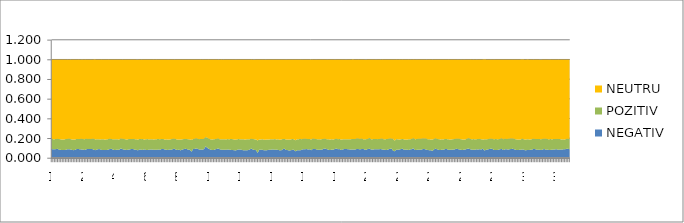
| Category | NEGATIV | POZITIV | NEUTRU |
|---|---|---|---|
| 0 | 0.092 | 0.109 | 0.799 |
| 1 | 0.091 | 0.102 | 0.807 |
| 2 | 0.089 | 0.103 | 0.808 |
| 3 | 0.092 | 0.103 | 0.805 |
| 4 | 0.095 | 0.101 | 0.804 |
| 5 | 0.085 | 0.109 | 0.806 |
| 6 | 0.084 | 0.107 | 0.809 |
| 7 | 0.082 | 0.107 | 0.811 |
| 8 | 0.082 | 0.107 | 0.811 |
| 9 | 0.084 | 0.11 | 0.806 |
| 10 | 0.089 | 0.106 | 0.804 |
| 11 | 0.091 | 0.107 | 0.802 |
| 12 | 0.089 | 0.106 | 0.804 |
| 13 | 0.084 | 0.106 | 0.81 |
| 14 | 0.081 | 0.108 | 0.811 |
| 15 | 0.083 | 0.106 | 0.811 |
| 16 | 0.092 | 0.103 | 0.805 |
| 17 | 0.092 | 0.102 | 0.807 |
| 18 | 0.091 | 0.103 | 0.806 |
| 19 | 0.088 | 0.109 | 0.802 |
| 20 | 0.087 | 0.108 | 0.806 |
| 21 | 0.083 | 0.109 | 0.808 |
| 22 | 0.089 | 0.108 | 0.804 |
| 23 | 0.093 | 0.102 | 0.805 |
| 24 | 0.094 | 0.102 | 0.804 |
| 25 | 0.093 | 0.101 | 0.805 |
| 26 | 0.092 | 0.105 | 0.803 |
| 27 | 0.085 | 0.111 | 0.805 |
| 28 | 0.081 | 0.109 | 0.811 |
| 29 | 0.087 | 0.106 | 0.807 |
| 30 | 0.092 | 0.1 | 0.808 |
| 31 | 0.091 | 0.099 | 0.81 |
| 32 | 0.083 | 0.109 | 0.809 |
| 33 | 0.082 | 0.111 | 0.807 |
| 34 | 0.082 | 0.106 | 0.812 |
| 35 | 0.082 | 0.109 | 0.809 |
| 36 | 0.086 | 0.107 | 0.808 |
| 37 | 0.092 | 0.105 | 0.803 |
| 38 | 0.095 | 0.1 | 0.805 |
| 39 | 0.088 | 0.104 | 0.808 |
| 40 | 0.083 | 0.108 | 0.809 |
| 41 | 0.084 | 0.109 | 0.807 |
| 42 | 0.085 | 0.107 | 0.808 |
| 43 | 0.084 | 0.105 | 0.811 |
| 44 | 0.098 | 0.101 | 0.801 |
| 45 | 0.093 | 0.104 | 0.802 |
| 46 | 0.087 | 0.108 | 0.805 |
| 47 | 0.085 | 0.107 | 0.808 |
| 48 | 0.083 | 0.106 | 0.811 |
| 49 | 0.087 | 0.107 | 0.806 |
| 50 | 0.089 | 0.105 | 0.806 |
| 51 | 0.094 | 0.1 | 0.806 |
| 52 | 0.092 | 0.104 | 0.804 |
| 53 | 0.086 | 0.107 | 0.807 |
| 54 | 0.084 | 0.107 | 0.808 |
| 55 | 0.079 | 0.111 | 0.809 |
| 56 | 0.089 | 0.106 | 0.805 |
| 57 | 0.086 | 0.107 | 0.806 |
| 58 | 0.083 | 0.112 | 0.805 |
| 59 | 0.09 | 0.099 | 0.811 |
| 60 | 0.083 | 0.109 | 0.808 |
| 61 | 0.083 | 0.111 | 0.806 |
| 62 | 0.085 | 0.105 | 0.81 |
| 63 | 0.087 | 0.106 | 0.807 |
| 64 | 0.088 | 0.104 | 0.808 |
| 65 | 0.084 | 0.106 | 0.811 |
| 66 | 0.084 | 0.107 | 0.809 |
| 67 | 0.085 | 0.108 | 0.808 |
| 68 | 0.087 | 0.107 | 0.806 |
| 69 | 0.085 | 0.107 | 0.808 |
| 70 | 0.093 | 0.102 | 0.805 |
| 71 | 0.093 | 0.102 | 0.805 |
| 72 | 0.088 | 0.101 | 0.811 |
| 73 | 0.085 | 0.106 | 0.809 |
| 74 | 0.083 | 0.105 | 0.811 |
| 75 | 0.088 | 0.101 | 0.811 |
| 76 | 0.084 | 0.108 | 0.808 |
| 77 | 0.091 | 0.106 | 0.803 |
| 78 | 0.095 | 0.103 | 0.801 |
| 79 | 0.088 | 0.106 | 0.806 |
| 80 | 0.083 | 0.105 | 0.812 |
| 81 | 0.086 | 0.104 | 0.81 |
| 82 | 0.079 | 0.109 | 0.812 |
| 83 | 0.086 | 0.105 | 0.809 |
| 84 | 0.091 | 0.103 | 0.806 |
| 85 | 0.095 | 0.101 | 0.804 |
| 86 | 0.092 | 0.102 | 0.806 |
| 87 | 0.086 | 0.106 | 0.808 |
| 88 | 0.084 | 0.106 | 0.81 |
| 89 | 0.065 | 0.12 | 0.815 |
| 90 | 0.092 | 0.101 | 0.807 |
| 91 | 0.094 | 0.103 | 0.803 |
| 92 | 0.099 | 0.102 | 0.799 |
| 93 | 0.094 | 0.102 | 0.804 |
| 94 | 0.087 | 0.106 | 0.807 |
| 95 | 0.089 | 0.106 | 0.806 |
| 96 | 0.085 | 0.108 | 0.806 |
| 97 | 0.094 | 0.104 | 0.802 |
| 98 | 0.119 | 0.097 | 0.784 |
| 99 | 0.106 | 0.101 | 0.793 |
| 100 | 0.094 | 0.104 | 0.803 |
| 101 | 0.088 | 0.104 | 0.808 |
| 102 | 0.082 | 0.108 | 0.81 |
| 103 | 0.082 | 0.109 | 0.809 |
| 104 | 0.09 | 0.104 | 0.806 |
| 105 | 0.093 | 0.103 | 0.804 |
| 106 | 0.099 | 0.101 | 0.799 |
| 107 | 0.09 | 0.101 | 0.809 |
| 108 | 0.085 | 0.108 | 0.808 |
| 109 | 0.084 | 0.108 | 0.807 |
| 110 | 0.085 | 0.107 | 0.808 |
| 111 | 0.084 | 0.106 | 0.81 |
| 112 | 0.089 | 0.105 | 0.806 |
| 113 | 0.085 | 0.106 | 0.809 |
| 114 | 0.084 | 0.111 | 0.805 |
| 115 | 0.082 | 0.111 | 0.807 |
| 116 | 0.081 | 0.109 | 0.81 |
| 117 | 0.078 | 0.11 | 0.811 |
| 118 | 0.084 | 0.108 | 0.808 |
| 119 | 0.088 | 0.106 | 0.806 |
| 120 | 0.088 | 0.103 | 0.809 |
| 121 | 0.083 | 0.108 | 0.809 |
| 122 | 0.08 | 0.112 | 0.808 |
| 123 | 0.079 | 0.11 | 0.811 |
| 124 | 0.079 | 0.112 | 0.809 |
| 125 | 0.082 | 0.109 | 0.809 |
| 126 | 0.088 | 0.104 | 0.808 |
| 127 | 0.097 | 0.101 | 0.803 |
| 128 | 0.087 | 0.107 | 0.805 |
| 129 | 0.083 | 0.109 | 0.807 |
| 130 | 0.081 | 0.108 | 0.811 |
| 131 | 0.053 | 0.127 | 0.82 |
| 132 | 0.086 | 0.104 | 0.81 |
| 133 | 0.084 | 0.105 | 0.811 |
| 134 | 0.085 | 0.108 | 0.807 |
| 135 | 0.08 | 0.108 | 0.812 |
| 136 | 0.079 | 0.109 | 0.811 |
| 137 | 0.081 | 0.108 | 0.811 |
| 138 | 0.084 | 0.105 | 0.811 |
| 139 | 0.085 | 0.106 | 0.809 |
| 140 | 0.087 | 0.104 | 0.809 |
| 141 | 0.088 | 0.103 | 0.809 |
| 142 | 0.084 | 0.11 | 0.806 |
| 143 | 0.087 | 0.102 | 0.811 |
| 144 | 0.083 | 0.109 | 0.808 |
| 145 | 0.08 | 0.107 | 0.813 |
| 146 | 0.08 | 0.11 | 0.81 |
| 147 | 0.091 | 0.104 | 0.805 |
| 148 | 0.096 | 0.099 | 0.805 |
| 149 | 0.083 | 0.107 | 0.809 |
| 150 | 0.082 | 0.106 | 0.812 |
| 151 | 0.078 | 0.111 | 0.811 |
| 152 | 0.08 | 0.109 | 0.811 |
| 153 | 0.084 | 0.111 | 0.805 |
| 154 | 0.085 | 0.107 | 0.808 |
| 155 | 0.069 | 0.112 | 0.819 |
| 156 | 0.079 | 0.114 | 0.807 |
| 157 | 0.08 | 0.111 | 0.809 |
| 158 | 0.079 | 0.118 | 0.804 |
| 159 | 0.085 | 0.107 | 0.807 |
| 160 | 0.091 | 0.106 | 0.803 |
| 161 | 0.091 | 0.106 | 0.803 |
| 162 | 0.092 | 0.104 | 0.804 |
| 163 | 0.088 | 0.106 | 0.806 |
| 164 | 0.09 | 0.104 | 0.806 |
| 165 | 0.081 | 0.109 | 0.809 |
| 166 | 0.093 | 0.106 | 0.802 |
| 167 | 0.094 | 0.102 | 0.804 |
| 168 | 0.091 | 0.104 | 0.804 |
| 169 | 0.085 | 0.106 | 0.809 |
| 170 | 0.085 | 0.107 | 0.808 |
| 171 | 0.085 | 0.105 | 0.81 |
| 172 | 0.087 | 0.107 | 0.806 |
| 173 | 0.095 | 0.101 | 0.804 |
| 174 | 0.096 | 0.101 | 0.803 |
| 175 | 0.091 | 0.101 | 0.807 |
| 176 | 0.085 | 0.107 | 0.808 |
| 177 | 0.082 | 0.107 | 0.811 |
| 178 | 0.087 | 0.105 | 0.808 |
| 179 | 0.086 | 0.103 | 0.811 |
| 180 | 0.093 | 0.101 | 0.805 |
| 181 | 0.097 | 0.101 | 0.802 |
| 182 | 0.091 | 0.101 | 0.808 |
| 183 | 0.092 | 0.103 | 0.805 |
| 184 | 0.082 | 0.106 | 0.812 |
| 185 | 0.089 | 0.102 | 0.809 |
| 186 | 0.092 | 0.099 | 0.809 |
| 187 | 0.094 | 0.098 | 0.807 |
| 188 | 0.091 | 0.101 | 0.808 |
| 189 | 0.09 | 0.103 | 0.807 |
| 190 | 0.086 | 0.105 | 0.809 |
| 191 | 0.088 | 0.107 | 0.806 |
| 192 | 0.088 | 0.107 | 0.806 |
| 193 | 0.088 | 0.106 | 0.806 |
| 194 | 0.094 | 0.107 | 0.799 |
| 195 | 0.092 | 0.107 | 0.802 |
| 196 | 0.089 | 0.106 | 0.805 |
| 197 | 0.092 | 0.107 | 0.801 |
| 198 | 0.094 | 0.099 | 0.807 |
| 199 | 0.086 | 0.106 | 0.807 |
| 200 | 0.086 | 0.107 | 0.806 |
| 201 | 0.093 | 0.103 | 0.804 |
| 202 | 0.095 | 0.11 | 0.795 |
| 203 | 0.089 | 0.104 | 0.807 |
| 204 | 0.087 | 0.106 | 0.807 |
| 205 | 0.089 | 0.105 | 0.806 |
| 206 | 0.09 | 0.104 | 0.805 |
| 207 | 0.089 | 0.104 | 0.807 |
| 208 | 0.091 | 0.104 | 0.805 |
| 209 | 0.092 | 0.104 | 0.803 |
| 210 | 0.089 | 0.11 | 0.802 |
| 211 | 0.086 | 0.107 | 0.807 |
| 212 | 0.084 | 0.108 | 0.808 |
| 213 | 0.083 | 0.111 | 0.806 |
| 214 | 0.088 | 0.108 | 0.804 |
| 215 | 0.095 | 0.104 | 0.801 |
| 216 | 0.097 | 0.101 | 0.802 |
| 217 | 0.076 | 0.121 | 0.803 |
| 218 | 0.069 | 0.109 | 0.822 |
| 219 | 0.086 | 0.108 | 0.807 |
| 220 | 0.085 | 0.106 | 0.809 |
| 221 | 0.087 | 0.103 | 0.811 |
| 222 | 0.092 | 0.099 | 0.809 |
| 223 | 0.096 | 0.1 | 0.805 |
| 224 | 0.084 | 0.106 | 0.81 |
| 225 | 0.087 | 0.103 | 0.81 |
| 226 | 0.085 | 0.104 | 0.811 |
| 227 | 0.083 | 0.109 | 0.809 |
| 228 | 0.089 | 0.103 | 0.807 |
| 229 | 0.092 | 0.105 | 0.803 |
| 230 | 0.1 | 0.102 | 0.799 |
| 231 | 0.083 | 0.109 | 0.808 |
| 232 | 0.084 | 0.11 | 0.805 |
| 233 | 0.085 | 0.112 | 0.803 |
| 234 | 0.084 | 0.112 | 0.804 |
| 235 | 0.087 | 0.11 | 0.803 |
| 236 | 0.092 | 0.109 | 0.799 |
| 237 | 0.092 | 0.106 | 0.802 |
| 238 | 0.087 | 0.112 | 0.8 |
| 239 | 0.082 | 0.11 | 0.808 |
| 240 | 0.081 | 0.11 | 0.809 |
| 241 | 0.081 | 0.109 | 0.81 |
| 242 | 0.074 | 0.115 | 0.81 |
| 243 | 0.089 | 0.106 | 0.805 |
| 244 | 0.096 | 0.106 | 0.798 |
| 245 | 0.09 | 0.104 | 0.806 |
| 246 | 0.084 | 0.109 | 0.807 |
| 247 | 0.083 | 0.107 | 0.81 |
| 248 | 0.085 | 0.106 | 0.809 |
| 249 | 0.086 | 0.104 | 0.81 |
| 250 | 0.092 | 0.104 | 0.804 |
| 251 | 0.093 | 0.101 | 0.806 |
| 252 | 0.086 | 0.105 | 0.81 |
| 253 | 0.086 | 0.104 | 0.81 |
| 254 | 0.084 | 0.106 | 0.81 |
| 255 | 0.087 | 0.105 | 0.808 |
| 256 | 0.088 | 0.107 | 0.805 |
| 257 | 0.096 | 0.101 | 0.803 |
| 258 | 0.092 | 0.106 | 0.801 |
| 259 | 0.089 | 0.108 | 0.803 |
| 260 | 0.085 | 0.107 | 0.807 |
| 261 | 0.082 | 0.108 | 0.81 |
| 262 | 0.086 | 0.103 | 0.81 |
| 263 | 0.088 | 0.103 | 0.809 |
| 264 | 0.095 | 0.103 | 0.802 |
| 265 | 0.097 | 0.106 | 0.797 |
| 266 | 0.09 | 0.106 | 0.805 |
| 267 | 0.086 | 0.105 | 0.809 |
| 268 | 0.085 | 0.109 | 0.805 |
| 269 | 0.085 | 0.106 | 0.809 |
| 270 | 0.09 | 0.103 | 0.806 |
| 271 | 0.087 | 0.107 | 0.806 |
| 272 | 0.091 | 0.105 | 0.804 |
| 273 | 0.088 | 0.104 | 0.808 |
| 274 | 0.095 | 0.095 | 0.811 |
| 275 | 0.078 | 0.113 | 0.81 |
| 276 | 0.084 | 0.108 | 0.809 |
| 277 | 0.088 | 0.105 | 0.807 |
| 278 | 0.092 | 0.104 | 0.804 |
| 279 | 0.096 | 0.102 | 0.801 |
| 280 | 0.094 | 0.103 | 0.803 |
| 281 | 0.084 | 0.108 | 0.807 |
| 282 | 0.083 | 0.111 | 0.806 |
| 283 | 0.082 | 0.111 | 0.807 |
| 284 | 0.086 | 0.107 | 0.807 |
| 285 | 0.091 | 0.105 | 0.804 |
| 286 | 0.094 | 0.108 | 0.798 |
| 287 | 0.082 | 0.11 | 0.808 |
| 288 | 0.089 | 0.109 | 0.802 |
| 289 | 0.091 | 0.104 | 0.805 |
| 290 | 0.087 | 0.109 | 0.804 |
| 291 | 0.09 | 0.108 | 0.802 |
| 292 | 0.093 | 0.107 | 0.8 |
| 293 | 0.095 | 0.104 | 0.801 |
| 294 | 0.09 | 0.106 | 0.804 |
| 295 | 0.084 | 0.107 | 0.809 |
| 296 | 0.082 | 0.108 | 0.81 |
| 297 | 0.084 | 0.105 | 0.811 |
| 298 | 0.084 | 0.105 | 0.812 |
| 299 | 0.088 | 0.111 | 0.802 |
| 300 | 0.086 | 0.106 | 0.809 |
| 301 | 0.079 | 0.11 | 0.811 |
| 302 | 0.082 | 0.109 | 0.81 |
| 303 | 0.083 | 0.108 | 0.81 |
| 304 | 0.084 | 0.105 | 0.811 |
| 305 | 0.085 | 0.107 | 0.808 |
| 306 | 0.093 | 0.105 | 0.801 |
| 307 | 0.093 | 0.102 | 0.805 |
| 308 | 0.087 | 0.107 | 0.806 |
| 309 | 0.085 | 0.11 | 0.805 |
| 310 | 0.085 | 0.109 | 0.805 |
| 311 | 0.083 | 0.109 | 0.807 |
| 312 | 0.087 | 0.109 | 0.804 |
| 313 | 0.094 | 0.104 | 0.802 |
| 314 | 0.083 | 0.115 | 0.802 |
| 315 | 0.088 | 0.106 | 0.806 |
| 316 | 0.082 | 0.11 | 0.807 |
| 317 | 0.084 | 0.11 | 0.807 |
| 318 | 0.086 | 0.105 | 0.809 |
| 319 | 0.087 | 0.108 | 0.805 |
| 320 | 0.089 | 0.104 | 0.807 |
| 321 | 0.089 | 0.107 | 0.804 |
| 322 | 0.086 | 0.108 | 0.807 |
| 323 | 0.087 | 0.107 | 0.806 |
| 324 | 0.087 | 0.103 | 0.81 |
| 325 | 0.089 | 0.102 | 0.809 |
| 326 | 0.089 | 0.1 | 0.811 |
| 327 | 0.094 | 0.102 | 0.804 |
| 328 | 0.096 | 0.101 | 0.803 |
| 329 | 0.089 | 0.104 | 0.807 |